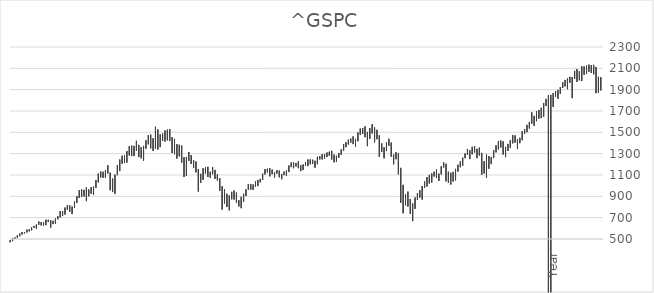
| Category | Series 0 | Series 1 | Series 2 |
|---|---|---|---|
| 0 | 2016.5 | 1893.7 | 2013.43 |
| 1 | 2020.86 | 1871.91 | 1920.03 |
| 2 | 2112.66 | 1867.01 | 1972.18 |
| 3 | 2132.82 | 2044.02 | 2103.84 |
| 4 | 2129.87 | 2056.32 | 2063.11 |
| 5 | 2134.72 | 2067.93 | 2107.39 |
| 6 | 2125.92 | 2048.38 | 2085.51 |
| 7 | 2117.52 | 2039.69 | 2067.89 |
| 8 | 2119.59 | 1980.9 | 2104.5 |
| 9 | 2072.36 | 1988.12 | 1994.99 |
| 10 | 2093.55 | 1972.56 | 2058.9 |
| 11 | 2075.76 | 2001.01 | 2067.56 |
| 12 | 2018.19 | 1820.66 | 2018.05 |
| 13 | 2019.26 | 1964.04 | 1972.29 |
| 14 | 2005.04 | 1904.78 | 2003.37 |
| 15 | 1991.39 | 1930.67 | 1930.67 |
| 16 | 1968.17 | 1915.98 | 1960.23 |
| 17 | 1924.03 | 1859.79 | 1923.57 |
| 18 | 1897.28 | 1814.36 | 1883.95 |
| 19 | 1883.97 | 1834.44 | 1872.34 |
| 20 | 1867.92 | 1737.92 | 1859.45 |
| 21 | 1850.84 | 1770.45 | 1782.59 |
| 22 | 1849.44 | 1767.99 | 1848.36 |
| 23 | 1813.55 | 1746.2 | 1805.81 |
| 24 | 1775.22 | 1646.47 | 1756.54 |
| 25 | 1729.86 | 1633.41 | 1681.55 |
| 26 | 1709.67 | 1627.47 | 1632.97 |
| 27 | 1698.78 | 1604.57 | 1685.73 |
| 28 | 1654.19 | 1560.33 | 1606.28 |
| 29 | 1687.18 | 1581.28 | 1630.74 |
| 30 | 1597.57 | 1536.03 | 1597.57 |
| 31 | 1570.28 | 1501.48 | 1569.19 |
| 32 | 1530.94 | 1485.01 | 1514.68 |
| 33 | 1509.94 | 1426.19 | 1498.11 |
| 34 | 1448 | 1398.11 | 1426.19 |
| 35 | 1434.27 | 1343.35 | 1416.18 |
| 36 | 1470.96 | 1403.28 | 1412.16 |
| 37 | 1474.51 | 1396.56 | 1440.67 |
| 38 | 1426.68 | 1354.65 | 1406.58 |
| 39 | 1391.74 | 1325.41 | 1379.32 |
| 40 | 1363.46 | 1266.74 | 1362.16 |
| 41 | 1415.32 | 1291.98 | 1310.33 |
| 42 | 1422.38 | 1357.38 | 1397.91 |
| 43 | 1419.15 | 1340.03 | 1408.47 |
| 44 | 1378.04 | 1312.45 | 1365.68 |
| 45 | 1333.47 | 1258.86 | 1312.41 |
| 46 | 1269.37 | 1202.37 | 1257.6 |
| 47 | 1277.55 | 1158.66 | 1246.96 |
| 48 | 1292.66 | 1074.77 | 1253.3 |
| 49 | 1229.29 | 1114.22 | 1131.42 |
| 50 | 1307.38 | 1101.54 | 1218.89 |
| 51 | 1356.48 | 1282.86 | 1292.28 |
| 52 | 1345.2 | 1258.07 | 1320.64 |
| 53 | 1370.58 | 1311.8 | 1345.2 |
| 54 | 1364.56 | 1294.7 | 1363.61 |
| 55 | 1332.28 | 1249.05 | 1325.83 |
| 56 | 1344.07 | 1289.14 | 1327.22 |
| 57 | 1302.67 | 1257.62 | 1286.12 |
| 58 | 1262.6 | 1186.6 | 1257.64 |
| 59 | 1227.08 | 1173 | 1180.55 |
| 60 | 1196.14 | 1131.87 | 1183.26 |
| 61 | 1157.16 | 1049.72 | 1141.2 |
| 62 | 1129.24 | 1039.7 | 1049.33 |
| 63 | 1120.95 | 1010.91 | 1101.6 |
| 64 | 1131.23 | 1028.33 | 1030.71 |
| 65 | 1205.13 | 1040.78 | 1089.41 |
| 66 | 1219.8 | 1170.69 | 1186.69 |
| 67 | 1180.69 | 1105.36 | 1169.43 |
| 68 | 1112.42 | 1044.5 | 1104.49 |
| 69 | 1150.45 | 1071.59 | 1073.87 |
| 70 | 1130.38 | 1085.89 | 1115.1 |
| 71 | 1113.69 | 1029.38 | 1095.63 |
| 72 | 1101.36 | 1019.95 | 1036.19 |
| 73 | 1080.15 | 991.97 | 1057.08 |
| 74 | 1039.47 | 978.51 | 1020.62 |
| 75 | 996.68 | 869.32 | 987.48 |
| 76 | 956.23 | 888.86 | 919.32 |
| 77 | 930.17 | 866.1 | 919.14 |
| 78 | 888.7 | 783.32 | 872.81 |
| 79 | 832.98 | 666.79 | 797.87 |
| 80 | 875.01 | 734.52 | 735.09 |
| 81 | 943.85 | 804.3 | 825.88 |
| 82 | 918.85 | 815.69 | 903.25 |
| 83 | 1007.51 | 741.02 | 896.24 |
| 84 | 1167.03 | 839.8 | 968.75 |
| 85 | 1303.04 | 1106.42 | 1166.36 |
| 86 | 1313.15 | 1247.45 | 1282.83 |
| 87 | 1292.17 | 1200.44 | 1267.38 |
| 88 | 1404.05 | 1272 | 1280 |
| 89 | 1440.24 | 1373.07 | 1400.38 |
| 90 | 1404.57 | 1324.35 | 1385.59 |
| 91 | 1359.68 | 1256.98 | 1322.7 |
| 92 | 1396.02 | 1316.75 | 1330.63 |
| 93 | 1471.77 | 1270.05 | 1378.55 |
| 94 | 1523.57 | 1435.65 | 1468.36 |
| 95 | 1545.79 | 1406.1 | 1481.14 |
| 96 | 1576.09 | 1489.56 | 1549.38 |
| 97 | 1538.74 | 1439.29 | 1526.75 |
| 98 | 1503.89 | 1370.6 | 1473.99 |
| 99 | 1555.9 | 1454.25 | 1455.27 |
| 100 | 1540.56 | 1484.18 | 1503.35 |
| 101 | 1535.56 | 1476.7 | 1530.62 |
| 102 | 1498.02 | 1416.37 | 1482.37 |
| 103 | 1438.89 | 1363.98 | 1420.86 |
| 104 | 1461.57 | 1389.42 | 1406.82 |
| 105 | 1441.61 | 1403.97 | 1438.24 |
| 106 | 1431.81 | 1385.93 | 1418.3 |
| 107 | 1407.89 | 1360.98 | 1400.63 |
| 108 | 1389.45 | 1327.1 | 1377.94 |
| 109 | 1340.28 | 1290.93 | 1335.85 |
| 110 | 1306.74 | 1261.3 | 1303.82 |
| 111 | 1280.42 | 1224.54 | 1276.66 |
| 112 | 1290.68 | 1219.29 | 1270.2 |
| 113 | 1326.7 | 1245.34 | 1270.09 |
| 114 | 1318.16 | 1280.74 | 1310.61 |
| 115 | 1310.88 | 1268.42 | 1294.87 |
| 116 | 1297.57 | 1253.61 | 1280.66 |
| 117 | 1294.9 | 1245.74 | 1280.08 |
| 118 | 1275.8 | 1246.59 | 1248.29 |
| 119 | 1270.64 | 1201.07 | 1249.48 |
| 120 | 1233.34 | 1168.2 | 1207.01 |
| 121 | 1243.13 | 1205.35 | 1228.81 |
| 122 | 1245.86 | 1201.07 | 1220.33 |
| 123 | 1245.15 | 1183.55 | 1234.18 |
| 124 | 1219.59 | 1188.3 | 1191.33 |
| 125 | 1199.56 | 1146.18 | 1191.5 |
| 126 | 1191.88 | 1136.15 | 1156.85 |
| 127 | 1229.11 | 1163.69 | 1180.59 |
| 128 | 1212.44 | 1180.95 | 1203.6 |
| 129 | 1217.8 | 1163.75 | 1181.27 |
| 130 | 1217.33 | 1173.78 | 1211.92 |
| 131 | 1188.46 | 1127.6 | 1173.82 |
| 132 | 1142.05 | 1090.29 | 1130.2 |
| 133 | 1131.54 | 1099.18 | 1114.58 |
| 134 | 1109.68 | 1060.72 | 1104.24 |
| 135 | 1140.84 | 1078.78 | 1101.72 |
| 136 | 1146.34 | 1113.32 | 1140.84 |
| 137 | 1127.74 | 1076.32 | 1120.68 |
| 138 | 1150.57 | 1107.23 | 1107.3 |
| 139 | 1163.23 | 1087.16 | 1126.21 |
| 140 | 1158.98 | 1124.44 | 1144.94 |
| 141 | 1155.38 | 1105.08 | 1131.13 |
| 142 | 1112.56 | 1053.41 | 1111.92 |
| 143 | 1063.65 | 1031.2 | 1058.2 |
| 144 | 1053.79 | 995.97 | 1050.71 |
| 145 | 1040.29 | 990.36 | 995.97 |
| 146 | 1011.01 | 960.84 | 1008.01 |
| 147 | 1015.41 | 962.1 | 990.31 |
| 148 | 1015.33 | 963.59 | 974.5 |
| 149 | 965.38 | 902.83 | 963.59 |
| 150 | 924.24 | 847.85 | 916.92 |
| 151 | 895.9 | 788.9 | 848.18 |
| 152 | 864.64 | 806.29 | 841.15 |
| 153 | 935.05 | 840.34 | 855.7 |
| 154 | 954.28 | 869.45 | 879.82 |
| 155 | 941.82 | 872.05 | 936.31 |
| 156 | 907.44 | 768.63 | 885.76 |
| 157 | 924.02 | 800.2 | 815.28 |
| 158 | 965 | 833.44 | 916.07 |
| 159 | 994.46 | 775.68 | 911.62 |
| 160 | 1070.74 | 952.92 | 989.82 |
| 161 | 1106.59 | 1048.96 | 1067.14 |
| 162 | 1147.84 | 1063.46 | 1076.92 |
| 163 | 1173.94 | 1106.73 | 1147.39 |
| 164 | 1130.2 | 1074.36 | 1106.73 |
| 165 | 1176.97 | 1081.66 | 1130.2 |
| 166 | 1173.62 | 1114.53 | 1148.08 |
| 167 | 1163.38 | 1054.31 | 1139.45 |
| 168 | 1110.61 | 1026.76 | 1059.78 |
| 169 | 1155.4 | 944.75 | 1040.94 |
| 170 | 1226.27 | 1124.87 | 1133.58 |
| 171 | 1239.78 | 1165.54 | 1211.23 |
| 172 | 1286.62 | 1203.03 | 1224.38 |
| 173 | 1315.93 | 1232 | 1255.82 |
| 174 | 1269.3 | 1091.99 | 1249.46 |
| 175 | 1267.42 | 1081.19 | 1160.33 |
| 176 | 1376.38 | 1215.44 | 1239.94 |
| 177 | 1383.37 | 1274.62 | 1366.01 |
| 178 | 1389.05 | 1254.07 | 1320.28 |
| 179 | 1438.46 | 1294.9 | 1314.95 |
| 180 | 1454.82 | 1305.79 | 1429.4 |
| 181 | 1530.09 | 1419.44 | 1436.51 |
| 182 | 1525.21 | 1425.43 | 1517.68 |
| 183 | 1517.32 | 1413.89 | 1430.83 |
| 184 | 1488.93 | 1420.6 | 1454.6 |
| 185 | 1481.51 | 1361.09 | 1420.6 |
| 186 | 1527.19 | 1339.4 | 1452.43 |
| 187 | 1552.87 | 1346.62 | 1498.58 |
| 188 | 1444.55 | 1325.07 | 1366.42 |
| 189 | 1478 | 1350.14 | 1394.46 |
| 190 | 1473.1 | 1387.38 | 1469.25 |
| 191 | 1425.31 | 1346.41 | 1388.91 |
| 192 | 1373.17 | 1233.7 | 1362.93 |
| 193 | 1361.39 | 1256.26 | 1282.71 |
| 194 | 1382.84 | 1267.73 | 1320.41 |
| 195 | 1420.33 | 1328.49 | 1328.72 |
| 196 | 1372.93 | 1277.47 | 1372.71 |
| 197 | 1375.98 | 1277.31 | 1301.84 |
| 198 | 1371.56 | 1282.56 | 1335.18 |
| 199 | 1323.82 | 1216.03 | 1286.37 |
| 200 | 1283.84 | 1211.89 | 1238.33 |
| 201 | 1280.37 | 1205.46 | 1279.64 |
| 202 | 1244.93 | 1136.89 | 1229.23 |
| 203 | 1192.97 | 1098.67 | 1163.63 |
| 204 | 1103.78 | 923.32 | 1098.67 |
| 205 | 1066.11 | 939.98 | 1017.01 |
| 206 | 1121.79 | 957.28 | 957.28 |
| 207 | 1190.58 | 1114.3 | 1120.67 |
| 208 | 1145.15 | 1074.67 | 1133.84 |
| 209 | 1130.52 | 1074.39 | 1090.82 |
| 210 | 1132.98 | 1076.7 | 1111.75 |
| 211 | 1113.07 | 1030.87 | 1101.75 |
| 212 | 1051.66 | 980.28 | 1049.34 |
| 213 | 992.65 | 912.83 | 980.28 |
| 214 | 986.25 | 924.92 | 970.43 |
| 215 | 964.55 | 900.61 | 955.4 |
| 216 | 983.12 | 855.27 | 914.62 |
| 217 | 960.59 | 899.47 | 947.28 |
| 218 | 964.17 | 893.34 | 899.47 |
| 219 | 957.73 | 884.54 | 954.31 |
| 220 | 902.09 | 838.82 | 885.14 |
| 221 | 851.87 | 793.21 | 848.28 |
| 222 | 804.13 | 733.54 | 801.34 |
| 223 | 814.9 | 756.13 | 757.12 |
| 224 | 817.68 | 773.43 | 790.82 |
| 225 | 794.67 | 729.55 | 786.16 |
| 226 | 761.75 | 716.69 | 740.74 |
| 227 | 762.12 | 701.3 | 757.02 |
| 228 | 714.1 | 684.44 | 705.27 |
| 229 | 690.88 | 643.97 | 687.33 |
| 230 | 670.68 | 639.49 | 651.99 |
| 231 | 675.88 | 605.88 | 639.95 |
| 232 | 680.32 | 658.75 | 670.63 |
| 233 | 681.1 | 630.07 | 669.12 |
| 234 | 656.68 | 624.14 | 654.17 |
| 235 | 656.97 | 627.63 | 645.5 |
| 236 | 664.23 | 633.71 | 640.43 |
| 237 | 636.18 | 597.29 | 636.02 |
| 238 | 622.88 | 605.05 | 615.93 |
| 239 | 608.69 | 581.04 | 605.37 |
| 240 | 590.66 | 571.55 | 581.5 |
| 241 | 587.61 | 561.01 | 584.41 |
| 242 | 565.62 | 553.04 | 561.88 |
| 243 | 565.4 | 542.51 | 562.06 |
| 244 | 551.07 | 526 | 544.75 |
| 245 | 533.41 | 513.03 | 533.4 |
| 246 | 515.29 | 500.2 | 514.71 |
| 247 | 508.15 | 479.7 | 500.71 |
| 248 | 489.19 | 469.29 | 487.39 |